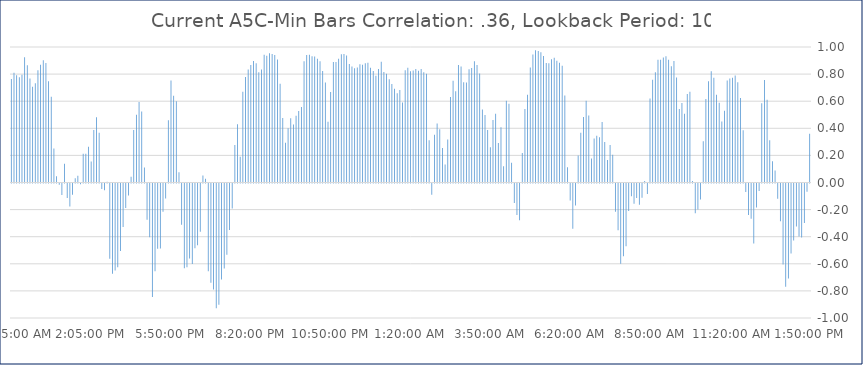
| Category | Series 0 |
|---|---|
| 2020-07-28 13:50:00 | 0.361 |
| 2020-07-28 13:45:00 | -0.061 |
| 2020-07-28 13:40:00 | -0.292 |
| 2020-07-28 13:35:00 | -0.399 |
| 2020-07-28 13:30:00 | -0.391 |
| 2020-07-28 13:25:00 | -0.317 |
| 2020-07-28 13:20:00 | -0.42 |
| 2020-07-28 13:15:00 | -0.517 |
| 2020-07-28 13:10:00 | -0.702 |
| 2020-07-28 13:05:00 | -0.762 |
| 2020-07-28 13:00:00 | -0.597 |
| 2020-07-28 12:55:00 | -0.279 |
| 2020-07-28 12:50:00 | -0.113 |
| 2020-07-28 12:45:00 | 0.088 |
| 2020-07-28 12:40:00 | 0.157 |
| 2020-07-28 12:35:00 | 0.311 |
| 2020-07-28 12:30:00 | 0.61 |
| 2020-07-28 12:25:00 | 0.756 |
| 2020-07-28 12:20:00 | 0.585 |
| 2020-07-28 12:15:00 | -0.056 |
| 2020-07-28 12:10:00 | -0.177 |
| 2020-07-28 12:05:00 | -0.443 |
| 2020-07-28 12:00:00 | -0.26 |
| 2020-07-28 11:55:00 | -0.232 |
| 2020-07-28 11:50:00 | -0.062 |
| 2020-07-28 11:45:00 | 0.385 |
| 2020-07-28 11:40:00 | 0.624 |
| 2020-07-28 11:35:00 | 0.74 |
| 2020-07-28 11:30:00 | 0.79 |
| 2020-07-28 11:25:00 | 0.774 |
| 2020-07-28 11:20:00 | 0.768 |
| 2020-07-28 11:15:00 | 0.752 |
| 2020-07-28 11:10:00 | 0.53 |
| 2020-07-28 11:05:00 | 0.451 |
| 2020-07-28 11:00:00 | 0.589 |
| 2020-07-28 10:55:00 | 0.647 |
| 2020-07-28 10:50:00 | 0.772 |
| 2020-07-28 10:45:00 | 0.821 |
| 2020-07-28 10:40:00 | 0.748 |
| 2020-07-28 10:35:00 | 0.617 |
| 2020-07-28 10:30:00 | 0.304 |
| 2020-07-28 10:25:00 | -0.119 |
| 2020-07-28 10:20:00 | -0.192 |
| 2020-07-28 10:15:00 | -0.22 |
| 2020-07-28 10:10:00 | 0.01 |
| 2020-07-28 10:05:00 | 0.67 |
| 2020-07-28 10:00:00 | 0.653 |
| 2020-07-28 09:55:00 | 0.507 |
| 2020-07-28 09:50:00 | 0.586 |
| 2020-07-28 09:45:00 | 0.543 |
| 2020-07-28 09:40:00 | 0.776 |
| 2020-07-28 09:35:00 | 0.896 |
| 2020-07-28 09:30:00 | 0.857 |
| 2020-07-28 09:25:00 | 0.906 |
| 2020-07-28 09:20:00 | 0.931 |
| 2020-07-28 09:15:00 | 0.923 |
| 2020-07-28 09:10:00 | 0.906 |
| 2020-07-28 09:05:00 | 0.906 |
| 2020-07-28 09:00:00 | 0.814 |
| 2020-07-28 08:55:00 | 0.758 |
| 2020-07-28 08:50:00 | 0.621 |
| 2020-07-28 08:45:00 | -0.078 |
| 2020-07-28 08:40:00 | 0.01 |
| 2020-07-28 08:35:00 | -0.106 |
| 2020-07-28 08:30:00 | -0.156 |
| 2020-07-28 08:25:00 | -0.108 |
| 2020-07-28 08:20:00 | -0.15 |
| 2020-07-28 08:15:00 | -0.095 |
| 2020-07-28 08:10:00 | -0.203 |
| 2020-07-28 08:05:00 | -0.463 |
| 2020-07-28 08:00:00 | -0.536 |
| 2020-07-28 07:55:00 | -0.593 |
| 2020-07-28 07:50:00 | -0.345 |
| 2020-07-28 07:45:00 | -0.208 |
| 2020-07-28 07:40:00 | 0.205 |
| 2020-07-28 07:35:00 | 0.277 |
| 2020-07-28 07:30:00 | 0.165 |
| 2020-07-28 07:25:00 | 0.299 |
| 2020-07-28 07:20:00 | 0.446 |
| 2020-07-28 07:15:00 | 0.333 |
| 2020-07-28 07:10:00 | 0.344 |
| 2020-07-28 07:05:00 | 0.326 |
| 2020-07-28 07:00:00 | 0.177 |
| 2020-07-28 06:55:00 | 0.494 |
| 2020-07-28 06:50:00 | 0.604 |
| 2020-07-28 06:45:00 | 0.483 |
| 2020-07-28 06:40:00 | 0.367 |
| 2020-07-28 06:35:00 | 0.2 |
| 2020-07-28 06:30:00 | -0.162 |
| 2020-07-28 06:25:00 | -0.335 |
| 2020-07-28 06:20:00 | -0.126 |
| 2020-07-28 06:15:00 | 0.112 |
| 2020-07-28 06:10:00 | 0.642 |
| 2020-07-28 06:05:00 | 0.862 |
| 2020-07-28 06:00:00 | 0.883 |
| 2020-07-28 05:55:00 | 0.898 |
| 2020-07-28 05:50:00 | 0.92 |
| 2020-07-28 05:45:00 | 0.91 |
| 2020-07-28 05:40:00 | 0.881 |
| 2020-07-28 05:35:00 | 0.881 |
| 2020-07-28 05:30:00 | 0.933 |
| 2020-07-28 05:25:00 | 0.962 |
| 2020-07-28 05:20:00 | 0.97 |
| 2020-07-28 05:15:00 | 0.976 |
| 2020-07-28 05:10:00 | 0.945 |
| 2020-07-28 05:05:00 | 0.85 |
| 2020-07-28 05:00:00 | 0.648 |
| 2020-07-28 04:55:00 | 0.543 |
| 2020-07-28 04:50:00 | 0.218 |
| 2020-07-28 04:45:00 | -0.271 |
| 2020-07-28 04:40:00 | -0.232 |
| 2020-07-28 04:35:00 | -0.143 |
| 2020-07-28 04:30:00 | 0.147 |
| 2020-07-28 04:25:00 | 0.581 |
| 2020-07-28 04:20:00 | 0.602 |
| 2020-07-28 04:15:00 | 0.12 |
| 2020-07-28 04:10:00 | 0.407 |
| 2020-07-28 04:05:00 | 0.291 |
| 2020-07-28 04:00:00 | 0.507 |
| 2020-07-28 03:55:00 | 0.461 |
| 2020-07-28 03:50:00 | 0.261 |
| 2020-07-28 03:45:00 | 0.388 |
| 2020-07-28 03:40:00 | 0.497 |
| 2020-07-28 03:35:00 | 0.539 |
| 2020-07-28 03:30:00 | 0.804 |
| 2020-07-28 03:25:00 | 0.866 |
| 2020-07-28 03:20:00 | 0.895 |
| 2020-07-28 03:15:00 | 0.846 |
| 2020-07-28 03:10:00 | 0.836 |
| 2020-07-28 03:05:00 | 0.739 |
| 2020-07-28 03:00:00 | 0.739 |
| 2020-07-28 02:55:00 | 0.855 |
| 2020-07-28 02:50:00 | 0.867 |
| 2020-07-28 02:45:00 | 0.673 |
| 2020-07-28 02:40:00 | 0.751 |
| 2020-07-28 02:35:00 | 0.631 |
| 2020-07-28 02:30:00 | 0.317 |
| 2020-07-28 02:25:00 | 0.134 |
| 2020-07-28 02:20:00 | 0.255 |
| 2020-07-28 02:15:00 | 0.393 |
| 2020-07-28 02:10:00 | 0.436 |
| 2020-07-28 02:05:00 | 0.352 |
| 2020-07-28 02:00:00 | -0.082 |
| 2020-07-28 01:55:00 | 0.311 |
| 2020-07-28 01:50:00 | 0.803 |
| 2020-07-28 01:45:00 | 0.813 |
| 2020-07-28 01:40:00 | 0.837 |
| 2020-07-28 01:35:00 | 0.825 |
| 2020-07-28 01:30:00 | 0.838 |
| 2020-07-28 01:25:00 | 0.826 |
| 2020-07-28 01:20:00 | 0.82 |
| 2020-07-28 01:15:00 | 0.848 |
| 2020-07-28 01:10:00 | 0.828 |
| 2020-07-28 01:05:00 | 0.591 |
| 2020-07-28 01:00:00 | 0.683 |
| 2020-07-28 00:55:00 | 0.659 |
| 2020-07-28 00:50:00 | 0.692 |
| 2020-07-28 00:45:00 | 0.727 |
| 2020-07-28 00:40:00 | 0.762 |
| 2020-07-28 00:35:00 | 0.802 |
| 2020-07-28 00:30:00 | 0.815 |
| 2020-07-28 00:25:00 | 0.891 |
| 2020-07-28 00:20:00 | 0.838 |
| 2020-07-28 00:15:00 | 0.788 |
| 2020-07-28 00:10:00 | 0.823 |
| 2020-07-28 00:05:00 | 0.846 |
| 2020-07-28 | 0.883 |
| 2020-07-27 23:55:00 | 0.881 |
| 2020-07-27 23:50:00 | 0.87 |
| 2020-07-27 23:45:00 | 0.873 |
| 2020-07-27 23:40:00 | 0.848 |
| 2020-07-27 23:35:00 | 0.843 |
| 2020-07-27 23:30:00 | 0.855 |
| 2020-07-27 23:25:00 | 0.874 |
| 2020-07-27 23:20:00 | 0.938 |
| 2020-07-27 23:15:00 | 0.948 |
| 2020-07-27 23:10:00 | 0.946 |
| 2020-07-27 23:05:00 | 0.913 |
| 2020-07-27 23:00:00 | 0.889 |
| 2020-07-27 22:55:00 | 0.889 |
| 2020-07-27 22:50:00 | 0.668 |
| 2020-07-27 22:45:00 | 0.448 |
| 2020-07-27 22:40:00 | 0.737 |
| 2020-07-27 22:35:00 | 0.824 |
| 2020-07-27 22:30:00 | 0.895 |
| 2020-07-27 22:25:00 | 0.914 |
| 2020-07-27 22:20:00 | 0.93 |
| 2020-07-27 22:15:00 | 0.932 |
| 2020-07-27 22:10:00 | 0.944 |
| 2020-07-27 22:05:00 | 0.942 |
| 2020-07-27 22:00:00 | 0.895 |
| 2020-07-27 21:55:00 | 0.557 |
| 2020-07-27 21:50:00 | 0.527 |
| 2020-07-27 21:45:00 | 0.492 |
| 2020-07-27 21:40:00 | 0.429 |
| 2020-07-27 21:35:00 | 0.475 |
| 2020-07-27 21:30:00 | 0.4 |
| 2020-07-27 21:25:00 | 0.294 |
| 2020-07-27 21:20:00 | 0.476 |
| 2020-07-27 21:15:00 | 0.728 |
| 2020-07-27 21:10:00 | 0.908 |
| 2020-07-27 21:05:00 | 0.94 |
| 2020-07-27 21:00:00 | 0.949 |
| 2020-07-27 20:55:00 | 0.954 |
| 2020-07-27 20:50:00 | 0.936 |
| 2020-07-27 20:45:00 | 0.942 |
| 2020-07-27 20:40:00 | 0.833 |
| 2020-07-27 20:35:00 | 0.814 |
| 2020-07-27 20:30:00 | 0.879 |
| 2020-07-27 20:25:00 | 0.896 |
| 2020-07-27 20:20:00 | 0.867 |
| 2020-07-27 20:15:00 | 0.833 |
| 2020-07-27 20:10:00 | 0.778 |
| 2020-07-27 20:05:00 | 0.67 |
| 2020-07-27 20:00:00 | 0.19 |
| 2020-07-27 19:55:00 | 0.43 |
| 2020-07-27 19:50:00 | 0.277 |
| 2020-07-27 19:45:00 | -0.184 |
| 2020-07-27 19:40:00 | -0.344 |
| 2020-07-27 19:35:00 | -0.526 |
| 2020-07-27 19:30:00 | -0.628 |
| 2020-07-27 19:25:00 | -0.709 |
| 2020-07-27 19:20:00 | -0.895 |
| 2020-07-27 19:15:00 | -0.92 |
| 2020-07-27 19:10:00 | -0.783 |
| 2020-07-27 19:05:00 | -0.732 |
| 2020-07-27 19:00:00 | -0.647 |
| 2020-07-27 18:55:00 | 0.028 |
| 2020-07-27 18:50:00 | 0.051 |
| 2020-07-27 18:45:00 | -0.357 |
| 2020-07-27 18:40:00 | -0.457 |
| 2020-07-27 18:35:00 | -0.477 |
| 2020-07-27 18:30:00 | -0.594 |
| 2020-07-27 18:25:00 | -0.553 |
| 2020-07-27 18:20:00 | -0.619 |
| 2020-07-27 18:15:00 | -0.625 |
| 2020-07-27 18:10:00 | -0.305 |
| 2020-07-27 18:05:00 | 0.076 |
| 2020-07-27 18:00:00 | 0.6 |
| 2020-07-27 17:55:00 | 0.64 |
| 2020-07-27 17:50:00 | 0.752 |
| 2020-07-27 17:45:00 | 0.46 |
| 2020-07-27 17:40:00 | -0.111 |
| 2020-07-27 17:35:00 | -0.208 |
| 2020-07-27 17:30:00 | -0.479 |
| 2020-07-27 17:25:00 | -0.482 |
| 2020-07-27 17:20:00 | -0.648 |
| 2020-07-27 17:15:00 | -0.837 |
| 2020-07-27 17:10:00 | -0.397 |
| 2020-07-27 17:05:00 | -0.267 |
| 2020-07-27 17:00:00 | 0.11 |
| 2020-07-27 15:55:00 | 0.523 |
| 2020-07-27 15:50:00 | 0.595 |
| 2020-07-27 15:45:00 | 0.5 |
| 2020-07-27 15:40:00 | 0.388 |
| 2020-07-27 15:35:00 | 0.042 |
| 2020-07-27 15:30:00 | -0.089 |
| 2020-07-27 15:10:00 | -0.181 |
| 2020-07-27 15:05:00 | -0.321 |
| 2020-07-27 15:00:00 | -0.498 |
| 2020-07-27 14:55:00 | -0.618 |
| 2020-07-27 14:50:00 | -0.643 |
| 2020-07-27 14:45:00 | -0.665 |
| 2020-07-27 14:40:00 | -0.555 |
| 2020-07-27 14:35:00 | 0.005 |
| 2020-07-27 14:30:00 | -0.051 |
| 2020-07-27 14:25:00 | -0.04 |
| 2020-07-27 14:20:00 | 0.367 |
| 2020-07-27 14:15:00 | 0.482 |
| 2020-07-27 14:10:00 | 0.387 |
| 2020-07-27 14:05:00 | 0.155 |
| 2020-07-27 14:00:00 | 0.263 |
| 2020-07-27 13:55:00 | 0.212 |
| 2020-07-27 13:50:00 | 0.213 |
| 2020-07-27 13:45:00 | -0.005 |
| 2020-07-27 13:40:00 | 0.051 |
| 2020-07-27 13:35:00 | 0.031 |
| 2020-07-27 13:30:00 | -0.084 |
| 2020-07-27 13:25:00 | -0.17 |
| 2020-07-27 13:20:00 | -0.107 |
| 2020-07-27 13:15:00 | 0.139 |
| 2020-07-27 13:10:00 | -0.084 |
| 2020-07-27 13:05:00 | -0.009 |
| 2020-07-27 13:00:00 | 0.047 |
| 2020-07-27 12:55:00 | 0.25 |
| 2020-07-27 12:50:00 | 0.632 |
| 2020-07-27 12:45:00 | 0.747 |
| 2020-07-27 12:40:00 | 0.882 |
| 2020-07-27 12:35:00 | 0.903 |
| 2020-07-27 12:30:00 | 0.868 |
| 2020-07-27 12:25:00 | 0.829 |
| 2020-07-27 12:20:00 | 0.732 |
| 2020-07-27 12:15:00 | 0.707 |
| 2020-07-27 12:10:00 | 0.768 |
| 2020-07-27 12:05:00 | 0.865 |
| 2020-07-27 12:00:00 | 0.925 |
| 2020-07-27 11:55:00 | 0.795 |
| 2020-07-27 11:50:00 | 0.777 |
| 2020-07-27 11:45:00 | 0.791 |
| 2020-07-27 11:40:00 | 0.811 |
| 2020-07-27 11:35:00 | 0.764 |